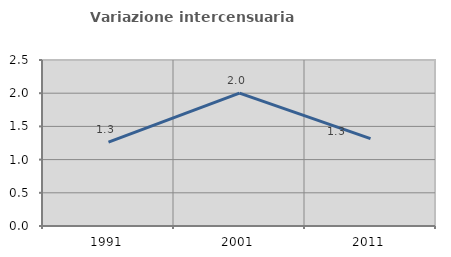
| Category | Variazione intercensuaria annua |
|---|---|
| 1991.0 | 1.262 |
| 2001.0 | 2 |
| 2011.0 | 1.316 |